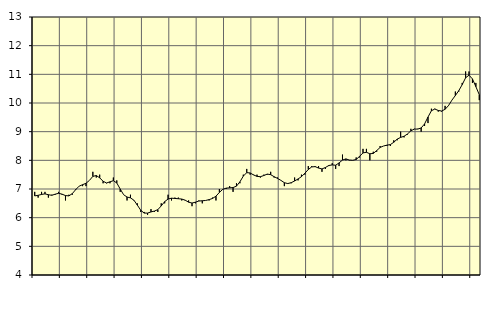
| Category | Piggar | Offentlig förvaltning m.m., SNI 84, 99 |
|---|---|---|
| nan | 6.9 | 6.76 |
| 87.0 | 6.7 | 6.78 |
| 87.0 | 6.9 | 6.81 |
| 87.0 | 6.9 | 6.83 |
| nan | 6.7 | 6.8 |
| 88.0 | 6.8 | 6.78 |
| 88.0 | 6.8 | 6.82 |
| 88.0 | 6.9 | 6.85 |
| nan | 6.8 | 6.82 |
| 89.0 | 6.6 | 6.77 |
| 89.0 | 6.8 | 6.76 |
| 89.0 | 6.8 | 6.84 |
| nan | 7 | 6.98 |
| 90.0 | 7.1 | 7.1 |
| 90.0 | 7.1 | 7.15 |
| 90.0 | 7.1 | 7.2 |
| nan | 7.3 | 7.3 |
| 91.0 | 7.6 | 7.44 |
| 91.0 | 7.4 | 7.47 |
| 91.0 | 7.5 | 7.39 |
| nan | 7.2 | 7.27 |
| 92.0 | 7.2 | 7.21 |
| 92.0 | 7.2 | 7.25 |
| 92.0 | 7.4 | 7.29 |
| nan | 7.3 | 7.21 |
| 93.0 | 6.9 | 7 |
| 93.0 | 6.8 | 6.8 |
| 93.0 | 6.6 | 6.72 |
| nan | 6.8 | 6.69 |
| 94.0 | 6.6 | 6.61 |
| 94.0 | 6.5 | 6.44 |
| 94.0 | 6.2 | 6.26 |
| nan | 6.2 | 6.16 |
| 95.0 | 6.1 | 6.16 |
| 95.0 | 6.3 | 6.2 |
| 95.0 | 6.2 | 6.23 |
| nan | 6.2 | 6.28 |
| 96.0 | 6.5 | 6.41 |
| 96.0 | 6.5 | 6.56 |
| 96.0 | 6.8 | 6.65 |
| nan | 6.6 | 6.68 |
| 97.0 | 6.7 | 6.67 |
| 97.0 | 6.7 | 6.66 |
| 97.0 | 6.6 | 6.65 |
| nan | 6.6 | 6.61 |
| 98.0 | 6.6 | 6.54 |
| 98.0 | 6.4 | 6.51 |
| 98.0 | 6.5 | 6.54 |
| nan | 6.6 | 6.58 |
| 99.0 | 6.5 | 6.59 |
| 99.0 | 6.6 | 6.6 |
| 99.0 | 6.6 | 6.63 |
| nan | 6.7 | 6.67 |
| 0.0 | 6.6 | 6.75 |
| 0.0 | 7 | 6.88 |
| 0.0 | 7 | 6.99 |
| nan | 7 | 7.03 |
| 1.0 | 7.1 | 7.04 |
| 1.0 | 6.9 | 7.05 |
| 1.0 | 7.2 | 7.1 |
| nan | 7.2 | 7.25 |
| 2.0 | 7.5 | 7.45 |
| 2.0 | 7.7 | 7.57 |
| 2.0 | 7.5 | 7.56 |
| nan | 7.5 | 7.49 |
| 3.0 | 7.5 | 7.44 |
| 3.0 | 7.4 | 7.43 |
| 3.0 | 7.5 | 7.47 |
| nan | 7.5 | 7.52 |
| 4.0 | 7.6 | 7.5 |
| 4.0 | 7.4 | 7.43 |
| 4.0 | 7.4 | 7.37 |
| nan | 7.3 | 7.3 |
| 5.0 | 7.1 | 7.22 |
| 5.0 | 7.2 | 7.19 |
| 5.0 | 7.2 | 7.22 |
| nan | 7.4 | 7.28 |
| 6.0 | 7.3 | 7.35 |
| 6.0 | 7.5 | 7.43 |
| 6.0 | 7.5 | 7.55 |
| nan | 7.8 | 7.68 |
| 7.0 | 7.8 | 7.77 |
| 7.0 | 7.8 | 7.78 |
| 7.0 | 7.8 | 7.73 |
| nan | 7.6 | 7.7 |
| 8.0 | 7.7 | 7.75 |
| 8.0 | 7.8 | 7.82 |
| 8.0 | 7.9 | 7.84 |
| nan | 7.7 | 7.83 |
| 9.0 | 7.8 | 7.91 |
| 9.0 | 8.2 | 8.01 |
| 9.0 | 8 | 8.05 |
| nan | 8 | 8.01 |
| 10.0 | 8 | 8 |
| 10.0 | 8.1 | 8.03 |
| 10.0 | 8.1 | 8.14 |
| nan | 8.4 | 8.26 |
| 11.0 | 8.4 | 8.28 |
| 11.0 | 8 | 8.23 |
| 11.0 | 8.3 | 8.24 |
| nan | 8.3 | 8.34 |
| 12.0 | 8.5 | 8.45 |
| 12.0 | 8.5 | 8.5 |
| 12.0 | 8.5 | 8.53 |
| nan | 8.5 | 8.55 |
| 13.0 | 8.7 | 8.63 |
| 13.0 | 8.7 | 8.74 |
| 13.0 | 9 | 8.8 |
| nan | 8.8 | 8.84 |
| 14.0 | 8.9 | 8.92 |
| 14.0 | 9.1 | 9.03 |
| 14.0 | 9.1 | 9.09 |
| nan | 9.1 | 9.09 |
| 15.0 | 9 | 9.13 |
| 15.0 | 9.2 | 9.27 |
| 15.0 | 9.3 | 9.51 |
| nan | 9.8 | 9.73 |
| 16.0 | 9.8 | 9.79 |
| 16.0 | 9.7 | 9.74 |
| 16.0 | 9.7 | 9.72 |
| nan | 9.9 | 9.78 |
| 17.0 | 9.9 | 9.91 |
| 17.0 | 10.1 | 10.1 |
| 17.0 | 10.4 | 10.26 |
| nan | 10.4 | 10.43 |
| 18.0 | 10.7 | 10.64 |
| 18.0 | 11.1 | 10.88 |
| 18.0 | 11.1 | 10.97 |
| nan | 10.7 | 10.84 |
| 19.0 | 10.7 | 10.57 |
| 19.0 | 10.1 | 10.29 |